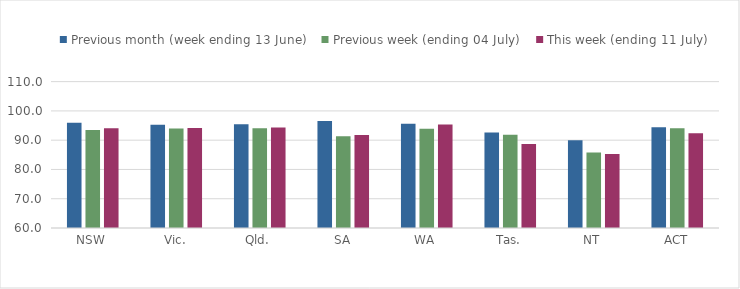
| Category | Previous month (week ending 13 June) | Previous week (ending 04 July) | This week (ending 11 July) |
|---|---|---|---|
| NSW | 95.922 | 93.48 | 94.089 |
| Vic. | 95.288 | 93.955 | 94.201 |
| Qld. | 95.462 | 94.055 | 94.336 |
| SA | 96.516 | 91.321 | 91.812 |
| WA | 95.615 | 93.865 | 95.365 |
| Tas. | 92.665 | 91.866 | 88.673 |
| NT | 89.942 | 85.78 | 85.255 |
| ACT | 94.457 | 94.111 | 92.379 |